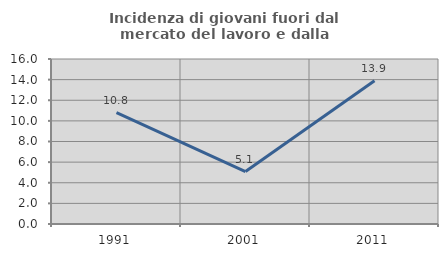
| Category | Incidenza di giovani fuori dal mercato del lavoro e dalla formazione  |
|---|---|
| 1991.0 | 10.811 |
| 2001.0 | 5.085 |
| 2011.0 | 13.889 |